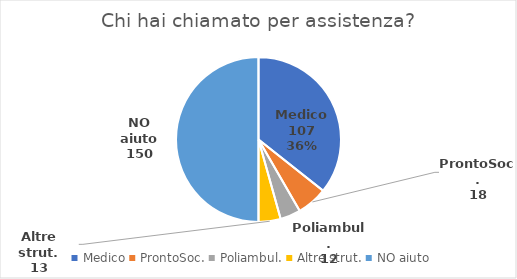
| Category | Chi hai chiamato per assistenza? |
|---|---|
| Medico | 107 |
| ProntoSoc. | 18 |
| Poliambul. | 12 |
| Altre strut. | 13 |
| NO aiuto | 150 |